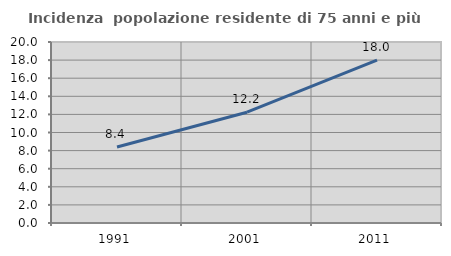
| Category | Incidenza  popolazione residente di 75 anni e più |
|---|---|
| 1991.0 | 8.394 |
| 2001.0 | 12.242 |
| 2011.0 | 17.999 |